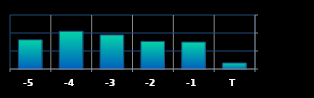
| Category | Series 0 |
|---|---|
| T | 33257 |
| -1 | 149632 |
| -2 | 153248 |
| -3 | 189193 |
| -4 | 209612 |
| -5 | 162084 |